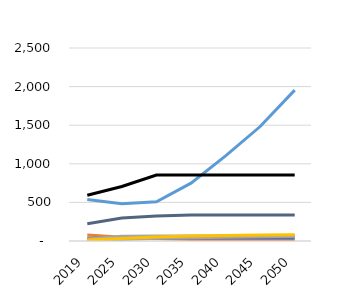
| Category | liquids | natural gas | coal | nuclear | hydro | other | wind | solar |
|---|---|---|---|---|---|---|---|---|
| 2019.0 | 77.92 | 538.19 | 593.2 | 37.21 | 224.79 | 26.84 | 9.54 | 11.95 |
| 2025.0 | 47.72 | 481.28 | 706.14 | 37.27 | 296.98 | 61.18 | 20.74 | 32.12 |
| 2030.0 | 31.63 | 507.91 | 855.41 | 37.27 | 324.8 | 65.65 | 37.15 | 52.65 |
| 2035.0 | 20.73 | 748.85 | 855.41 | 37.27 | 335.23 | 65.8 | 42.62 | 66.28 |
| 2040.0 | 13.36 | 1103.55 | 855.41 | 37.27 | 335.34 | 65.9 | 48.24 | 72.22 |
| 2045.0 | 8.36 | 1482.74 | 855.41 | 37.27 | 335.34 | 66.02 | 54.35 | 76.71 |
| 2050.0 | 4.97 | 1954.28 | 855.41 | 37.27 | 335.34 | 66.17 | 60.14 | 81.86 |